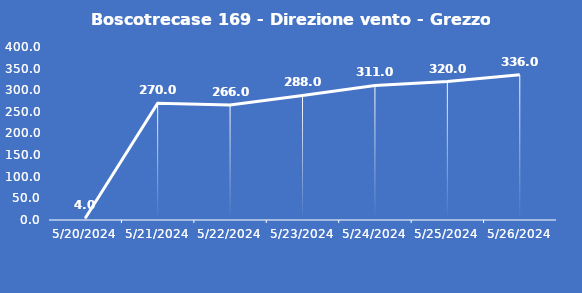
| Category | Boscotrecase 169 - Direzione vento - Grezzo (°N) |
|---|---|
| 5/20/24 | 4 |
| 5/21/24 | 270 |
| 5/22/24 | 266 |
| 5/23/24 | 288 |
| 5/24/24 | 311 |
| 5/25/24 | 320 |
| 5/26/24 | 336 |